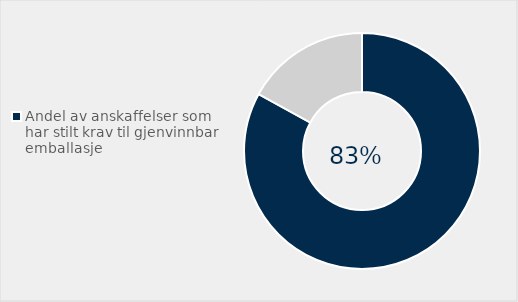
| Category | Series 0 |
|---|---|
| Andel av anskaffelser som har stilt krav til gjenvinnbar emballasje | 0.83 |
| Ikke stilt krav | 0.17 |